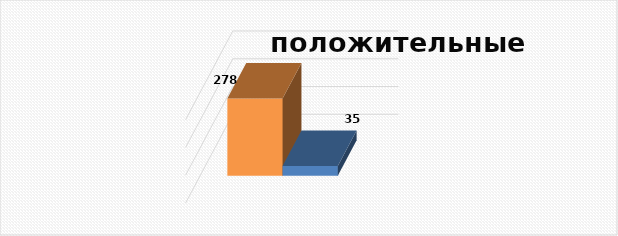
| Category | положительных |
|---|---|
| 223.0 | 35 |